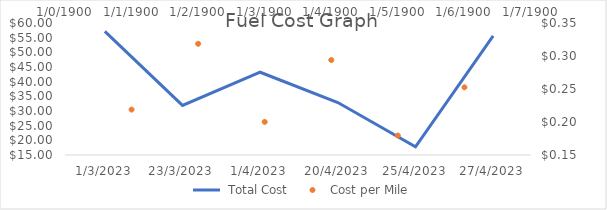
| Category |  Total Cost |
|---|---|
| 1/3/2023 | 57.161 |
| 23/3/2023 | 31.898 |
| 1/4/2023 | 43.218 |
| 20/4/2023 | 32.896 |
| 25/4/2023 | 17.765 |
| 27/4/2023 | 55.645 |